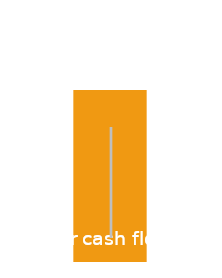
| Category | Positive | Negative |
|---|---|---|
| 0 | 1 | 1 |